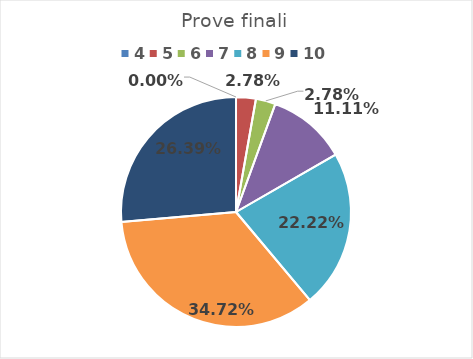
| Category | Series 0 |
|---|---|
| 4.0 | 0 |
| 5.0 | 0.028 |
| 6.0 | 0.028 |
| 7.0 | 0.111 |
| 8.0 | 0.222 |
| 9.0 | 0.347 |
| 10.0 | 0.264 |